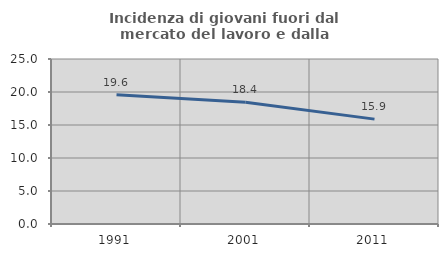
| Category | Incidenza di giovani fuori dal mercato del lavoro e dalla formazione  |
|---|---|
| 1991.0 | 19.601 |
| 2001.0 | 18.439 |
| 2011.0 | 15.891 |